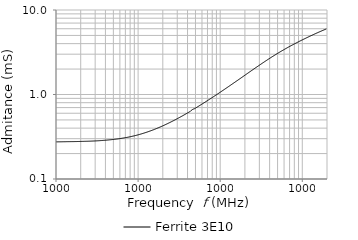
| Category | Ferrite 3E10 |
|---|---|
| 10000.0 | 0.276 |
| 10192.3 | 0.275 |
| 10388.3 | 0.275 |
| 10588.1 | 0.275 |
| 10791.8 | 0.275 |
| 10999.3 | 0.275 |
| 11210.9 | 0.275 |
| 11426.5 | 0.276 |
| 11646.2 | 0.276 |
| 11870.2 | 0.276 |
| 12098.5 | 0.276 |
| 12331.2 | 0.276 |
| 12568.4 | 0.276 |
| 12810.1 | 0.276 |
| 13056.5 | 0.276 |
| 13307.6 | 0.276 |
| 13563.5 | 0.276 |
| 13824.4 | 0.277 |
| 14090.2 | 0.277 |
| 14361.2 | 0.277 |
| 14637.4 | 0.277 |
| 14919.0 | 0.277 |
| 15205.9 | 0.277 |
| 15498.3 | 0.277 |
| 15796.4 | 0.277 |
| 16100.2 | 0.277 |
| 16409.9 | 0.277 |
| 16725.5 | 0.277 |
| 17047.1 | 0.277 |
| 17375.0 | 0.277 |
| 17709.2 | 0.277 |
| 18049.7 | 0.278 |
| 18396.9 | 0.278 |
| 18750.7 | 0.278 |
| 19111.3 | 0.278 |
| 19478.9 | 0.278 |
| 19853.5 | 0.278 |
| 20235.3 | 0.278 |
| 20624.5 | 0.279 |
| 21021.2 | 0.279 |
| 21425.5 | 0.279 |
| 21837.5 | 0.279 |
| 22257.5 | 0.279 |
| 22685.6 | 0.279 |
| 23121.9 | 0.279 |
| 23566.6 | 0.28 |
| 24019.8 | 0.28 |
| 24481.8 | 0.28 |
| 24952.6 | 0.28 |
| 25432.5 | 0.28 |
| 25921.7 | 0.28 |
| 26420.2 | 0.281 |
| 26928.3 | 0.281 |
| 27446.2 | 0.281 |
| 27974.1 | 0.281 |
| 28512.1 | 0.281 |
| 29060.5 | 0.282 |
| 29619.4 | 0.282 |
| 30189.0 | 0.282 |
| 30769.6 | 0.283 |
| 31361.4 | 0.283 |
| 31964.6 | 0.283 |
| 32579.3 | 0.283 |
| 33205.9 | 0.284 |
| 33844.5 | 0.284 |
| 34495.4 | 0.284 |
| 35158.9 | 0.285 |
| 35835.1 | 0.285 |
| 36524.3 | 0.286 |
| 37226.7 | 0.286 |
| 37942.7 | 0.286 |
| 38672.4 | 0.287 |
| 39416.2 | 0.287 |
| 40174.3 | 0.288 |
| 40946.9 | 0.288 |
| 41734.4 | 0.289 |
| 42537.1 | 0.289 |
| 43355.2 | 0.29 |
| 44189.0 | 0.29 |
| 45038.9 | 0.291 |
| 45905.1 | 0.291 |
| 46787.9 | 0.292 |
| 47687.8 | 0.292 |
| 48604.9 | 0.293 |
| 49539.7 | 0.294 |
| 50492.5 | 0.294 |
| 51463.6 | 0.295 |
| 52453.4 | 0.295 |
| 53462.2 | 0.296 |
| 54490.4 | 0.297 |
| 55538.4 | 0.298 |
| 56606.5 | 0.298 |
| 57695.2 | 0.299 |
| 58804.8 | 0.3 |
| 59935.8 | 0.301 |
| 61088.5 | 0.301 |
| 62263.4 | 0.302 |
| 63460.9 | 0.303 |
| 64681.4 | 0.304 |
| 65925.4 | 0.305 |
| 67193.3 | 0.306 |
| 68485.6 | 0.307 |
| 69802.7 | 0.308 |
| 71145.2 | 0.309 |
| 72513.5 | 0.31 |
| 73908.1 | 0.311 |
| 75329.5 | 0.312 |
| 76778.3 | 0.314 |
| 78255.0 | 0.315 |
| 79760.0 | 0.316 |
| 81294.0 | 0.317 |
| 82857.5 | 0.319 |
| 84451.0 | 0.32 |
| 86075.2 | 0.321 |
| 87730.7 | 0.323 |
| 89417.9 | 0.324 |
| 91137.7 | 0.325 |
| 92890.5 | 0.327 |
| 94677.0 | 0.328 |
| 96497.9 | 0.33 |
| 98353.8 | 0.332 |
| 100245.0 | 0.333 |
| 102173.0 | 0.335 |
| 104138.0 | 0.337 |
| 106141.0 | 0.339 |
| 108183.0 | 0.34 |
| 110263.0 | 0.342 |
| 112384.0 | 0.344 |
| 114545.0 | 0.346 |
| 116748.0 | 0.348 |
| 118994.0 | 0.35 |
| 121282.0 | 0.352 |
| 123615.0 | 0.355 |
| 125992.0 | 0.357 |
| 128415.0 | 0.359 |
| 130885.0 | 0.361 |
| 133402.0 | 0.364 |
| 135968.0 | 0.366 |
| 138583.0 | 0.368 |
| 141248.0 | 0.371 |
| 143965.0 | 0.373 |
| 146734.0 | 0.376 |
| 149556.0 | 0.379 |
| 152432.0 | 0.381 |
| 155364.0 | 0.384 |
| 158352.0 | 0.387 |
| 161397.0 | 0.39 |
| 164501.0 | 0.393 |
| 167665.0 | 0.395 |
| 170890.0 | 0.399 |
| 174176.0 | 0.402 |
| 177526.0 | 0.405 |
| 180940.0 | 0.408 |
| 184420.0 | 0.411 |
| 187967.0 | 0.415 |
| 191582.0 | 0.418 |
| 195267.0 | 0.421 |
| 199022.0 | 0.425 |
| 202850.0 | 0.428 |
| 206751.0 | 0.432 |
| 210728.0 | 0.436 |
| 214780.0 | 0.439 |
| 218911.0 | 0.443 |
| 223121.0 | 0.447 |
| 227413.0 | 0.451 |
| 231786.0 | 0.455 |
| 236244.0 | 0.459 |
| 240788.0 | 0.464 |
| 245419.0 | 0.468 |
| 250139.0 | 0.472 |
| 254949.0 | 0.477 |
| 259853.0 | 0.481 |
| 264850.0 | 0.486 |
| 269944.0 | 0.49 |
| 275136.0 | 0.495 |
| 280427.0 | 0.5 |
| 285821.0 | 0.505 |
| 291318.0 | 0.51 |
| 296920.0 | 0.515 |
| 302631.0 | 0.52 |
| 308451.0 | 0.525 |
| 314383.0 | 0.53 |
| 320430.0 | 0.536 |
| 326593.0 | 0.541 |
| 332874.0 | 0.547 |
| 339276.0 | 0.552 |
| 345801.0 | 0.558 |
| 352451.0 | 0.564 |
| 359230.0 | 0.569 |
| 366139.0 | 0.575 |
| 373181.0 | 0.582 |
| 380358.0 | 0.588 |
| 387673.0 | 0.594 |
| 395129.0 | 0.6 |
| 402728.0 | 0.607 |
| 410474.0 | 0.613 |
| 418368.0 | 0.62 |
| 426414.0 | 0.627 |
| 434615.0 | 0.633 |
| 442974.0 | 0.647 |
| 451494.0 | 0.656 |
| 460177.0 | 0.664 |
| 469027.0 | 0.672 |
| 478048.0 | 0.674 |
| 487242.0 | 0.68 |
| 496613.0 | 0.687 |
| 506164.0 | 0.695 |
| 515899.0 | 0.703 |
| 525821.0 | 0.711 |
| 535934.0 | 0.719 |
| 546241.0 | 0.728 |
| 556746.0 | 0.736 |
| 567454.0 | 0.744 |
| 578368.0 | 0.753 |
| 589491.0 | 0.762 |
| 600828.0 | 0.771 |
| 612384.0 | 0.78 |
| 624162.0 | 0.789 |
| 636166.0 | 0.798 |
| 648401.0 | 0.807 |
| 660871.0 | 0.817 |
| 673581.0 | 0.827 |
| 686536.0 | 0.836 |
| 699740.0 | 0.846 |
| 713198.0 | 0.857 |
| 726914.0 | 0.867 |
| 740894.0 | 0.877 |
| 755144.0 | 0.888 |
| 769667.0 | 0.899 |
| 784470.0 | 0.91 |
| 799557.0 | 0.921 |
| 814934.0 | 0.932 |
| 830608.0 | 0.943 |
| 846582.0 | 0.955 |
| 862864.0 | 0.966 |
| 879459.0 | 0.978 |
| 896373.0 | 0.99 |
| 913613.0 | 1.002 |
| 931184.0 | 1.015 |
| 949093.0 | 1.027 |
| 967346.0 | 1.04 |
| 985951.0 | 1.053 |
| 1004910.0 | 1.067 |
| 1024240.0 | 1.08 |
| 1043940.0 | 1.094 |
| 1064020.0 | 1.107 |
| 1084480.0 | 1.121 |
| 1105340.0 | 1.135 |
| 1126600.0 | 1.15 |
| 1148260.0 | 1.164 |
| 1170350.0 | 1.179 |
| 1192860.0 | 1.194 |
| 1215800.0 | 1.209 |
| 1239180.0 | 1.225 |
| 1263010.0 | 1.24 |
| 1287300.0 | 1.256 |
| 1312060.0 | 1.272 |
| 1337300.0 | 1.288 |
| 1363010.0 | 1.305 |
| 1389230.0 | 1.322 |
| 1415950.0 | 1.339 |
| 1443180.0 | 1.356 |
| 1470940.0 | 1.373 |
| 1499230.0 | 1.391 |
| 1528060.0 | 1.409 |
| 1557450.0 | 1.427 |
| 1587400.0 | 1.446 |
| 1617930.0 | 1.464 |
| 1649050.0 | 1.483 |
| 1680760.0 | 1.502 |
| 1713090.0 | 1.522 |
| 1746040.0 | 1.542 |
| 1779620.0 | 1.561 |
| 1813840.0 | 1.582 |
| 1848730.0 | 1.602 |
| 1884280.0 | 1.623 |
| 1920520.0 | 1.644 |
| 1957460.0 | 1.665 |
| 1995110.0 | 1.687 |
| 2033480.0 | 1.709 |
| 2072580.0 | 1.732 |
| 2112450.0 | 1.755 |
| 2153070.0 | 1.778 |
| 2194480.0 | 1.801 |
| 2236690.0 | 1.824 |
| 2279700.0 | 1.848 |
| 2323550.0 | 1.872 |
| 2368240.0 | 1.896 |
| 2413780.0 | 1.921 |
| 2460210.0 | 1.946 |
| 2507520.0 | 1.97 |
| 2555750.0 | 1.996 |
| 2604900.0 | 2.021 |
| 2655000.0 | 2.047 |
| 2706060.0 | 2.074 |
| 2758110.0 | 2.1 |
| 2811150.0 | 2.127 |
| 2865220.0 | 2.154 |
| 2920320.0 | 2.181 |
| 2976490.0 | 2.209 |
| 3033730.0 | 2.238 |
| 3092080.0 | 2.266 |
| 3151550.0 | 2.295 |
| 3212160.0 | 2.323 |
| 3273940.0 | 2.352 |
| 3336900.0 | 2.382 |
| 3401080.0 | 2.411 |
| 3466490.0 | 2.441 |
| 3533160.0 | 2.471 |
| 3601110.0 | 2.502 |
| 3670370.0 | 2.533 |
| 3740960.0 | 2.565 |
| 3812910.0 | 2.596 |
| 3886240.0 | 2.627 |
| 3960980.0 | 2.659 |
| 4037160.0 | 2.691 |
| 4114810.0 | 2.723 |
| 4193950.0 | 2.755 |
| 4274610.0 | 2.788 |
| 4356820.0 | 2.821 |
| 4440610.0 | 2.854 |
| 4526010.0 | 2.887 |
| 4613060.0 | 2.92 |
| 4701780.0 | 2.954 |
| 4792210.0 | 2.988 |
| 4884370.0 | 3.022 |
| 4978310.0 | 3.056 |
| 5074060.0 | 3.091 |
| 5171640.0 | 3.126 |
| 5271110.0 | 3.161 |
| 5372480.0 | 3.196 |
| 5475810.0 | 3.231 |
| 5581120.0 | 3.266 |
| 5688460.0 | 3.302 |
| 5797870.0 | 3.337 |
| 5909370.0 | 3.373 |
| 6023030.0 | 3.409 |
| 6138860.0 | 3.446 |
| 6256930.0 | 3.482 |
| 6377270.0 | 3.518 |
| 6499920.0 | 3.555 |
| 6624930.0 | 3.592 |
| 6752340.0 | 3.629 |
| 6882200.0 | 3.667 |
| 7014570.0 | 3.705 |
| 7149470.0 | 3.741 |
| 7286980.0 | 3.779 |
| 7427120.0 | 3.816 |
| 7569960.0 | 3.854 |
| 7715550.0 | 3.892 |
| 7863940.0 | 3.93 |
| 8015190.0 | 3.968 |
| 8169340.0 | 4.007 |
| 8326450.0 | 4.046 |
| 8486590.0 | 4.085 |
| 8649810.0 | 4.124 |
| 8816170.0 | 4.164 |
| 8985730.0 | 4.203 |
| 9158540.0 | 4.243 |
| 9334690.0 | 4.282 |
| 9514210.0 | 4.322 |
| 9697200.0 | 4.363 |
| 9883700.0 | 4.403 |
| 10073800.0 | 4.443 |
| 10267500.0 | 4.484 |
| 10465000.0 | 4.525 |
| 10666300.0 | 4.566 |
| 10871400.0 | 4.607 |
| 11080500.0 | 4.649 |
| 11293600.0 | 4.691 |
| 11510800.0 | 4.733 |
| 11732200.0 | 4.774 |
| 11957800.0 | 4.817 |
| 12187800.0 | 4.859 |
| 12422200.0 | 4.902 |
| 12661100.0 | 4.945 |
| 12904600.0 | 4.988 |
| 13152800.0 | 5.031 |
| 13405800.0 | 5.075 |
| 13663600.0 | 5.119 |
| 13926400.0 | 5.162 |
| 14194200.0 | 5.206 |
| 14467200.0 | 5.25 |
| 14745400.0 | 5.293 |
| 15029000.0 | 5.337 |
| 15318100.0 | 5.381 |
| 15612700.0 | 5.426 |
| 15913000.0 | 5.471 |
| 16219000.0 | 5.516 |
| 16530900.0 | 5.56 |
| 16848900.0 | 5.605 |
| 17172900.0 | 5.65 |
| 17503200.0 | 5.696 |
| 17839800.0 | 5.741 |
| 18182900.0 | 5.786 |
| 18532600.0 | 5.831 |
| 18889100.0 | 5.877 |
| 19252300.0 | 5.923 |
| 19622600.0 | 5.968 |